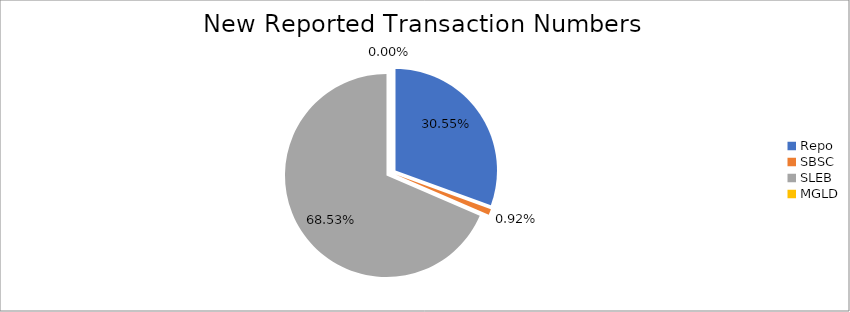
| Category | Series 0 |
|---|---|
| Repo | 304926 |
| SBSC | 9206 |
| SLEB | 683991 |
| MGLD | 13 |